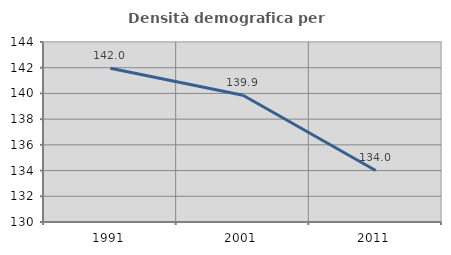
| Category | Densità demografica |
|---|---|
| 1991.0 | 141.966 |
| 2001.0 | 139.855 |
| 2011.0 | 134.01 |